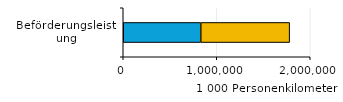
| Category | Öffentliche Unternehmen | Private und gemischtwirtschaftliche Unternehmen |
|---|---|---|
| 0 | 829136 | 950324 |